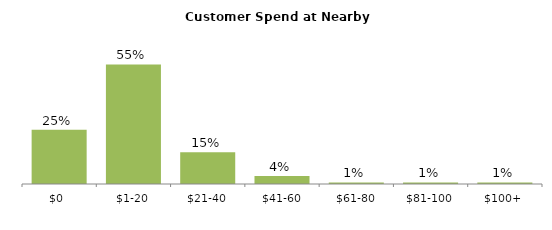
| Category | Series 0 |
|---|---|
| $0 | 0.248 |
| $1-20 | 0.547 |
| $21-40 | 0.146 |
| $41-60 | 0.036 |
| $61-80 | 0.007 |
| $81-100 | 0.007 |
| $100+ | 0.007 |